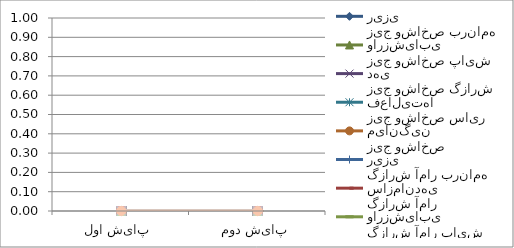
| Category | زیج وشاخص برنامه ریزی  | زیج وشاخص سازماندهی | زیج وشاخص پایش وارزشیابی | زیج وشاخص گزارش دهی | زیج وشاخص سایر فعالیتها | زیج وشاخص میانگین | گزارش آمار برنامه ریزی  | گزارش آمار سازماندهی | گزارش آمار پایش وارزشیابی | گزارش آمار گزارش دهی | گزارش آمار سایر فعالیتها | گزارش آمار میانگین | جمعیت  برنامه ریزی  | جمعیت  سازماندهی | جمعیت  پایش وارزشیابی | جمعیت  گزارش دهی | جمعیت  سایر فعالیتها | جمعیت  میانگین | نظام ثبت مرگ برنامه ریزی  | نظام ثبت مرگ سازماندهی | نظام ثبت مرگ پایش وارزشیابی | نظام ثبت مرگ گزارش دهی | نظام ثبت مرگ سایر فعالیتها | نظام ثبت مرگ میانگین | IT برنامه ریزی  | IT سازماندهی | IT پایش وارزشیابی | IT گزارش دهی | IT سایر فعالیتها | IT میانگین | کل برنامه ریزی  | کل سازماندهی | کل پایش وارزشیابی | کل گزارش دهی | کل سایر فعالیتها | کل میانگین | آمار برنامه ریزی  | آمار سازماندهی | آمار پایش وارزشیابی | آمار گزارش دهی | آمار سایر فعالیتها | آمار میانگین |
|---|---|---|---|---|---|---|---|---|---|---|---|---|---|---|---|---|---|---|---|---|---|---|---|---|---|---|---|---|---|---|---|---|---|---|---|---|---|---|---|---|---|---|
| پایش اول | 0 | 0 | 0 | 0 | 0 | 0 | 0 | 0 | 0 | 0 | 0 | 0 | 0 | 0 | 0 | 0 | 0 | 0 | 0 | 0 | 0 | 0 | 0 | 0 | 0 | 0 | 0 | 0 | 0 | 0 | 0 | 0 | 0 | 0 | 0 | 0 | 0 | 0 | 0 | 0 | 0 | 0 |
| پایش دوم | 0 | 0 | 0 | 0 | 0 | 0 | 0 | 0 | 0 | 0 | 0 | 0 | 0 | 0 | 0 | 0 | 0 | 0 | 0 | 0 | 0 | 0 | 0 | 0 | 0 | 0 | 0 | 0 | 0 | 0 | 0 | 0 | 0 | 0 | 0 | 0 | 0 | 0 | 0 | 0 | 0 | 0 |